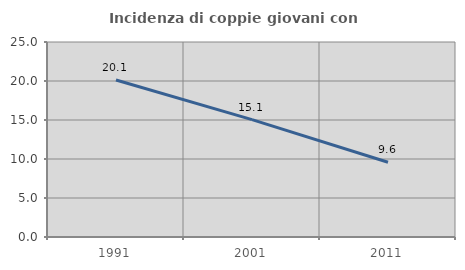
| Category | Incidenza di coppie giovani con figli |
|---|---|
| 1991.0 | 20.126 |
| 2001.0 | 15.051 |
| 2011.0 | 9.58 |